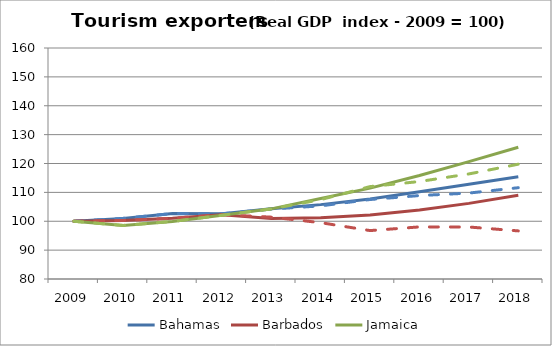
| Category | Bahamas | stress | Barbados | Jamaica |
|---|---|---|---|---|
| 2009.0 | 100 | 100 | 100 | 100 |
| 2010.0 | 100.992 | 98.553 | 100.282 | 98.553 |
| 2011.0 | 102.671 | 99.937 | 101.033 | 99.937 |
| 2012.0 | 102.571 | 102.081 | 102.29 | 102.081 |
| 2013.0 | 104.303 | 104.247 | 100.97 | 104.293 |
| 2014.0 | 105.755 | 107.484 | 101.184 | 107.853 |
| 2015.0 | 107.727 | 112.01 | 102.19 | 111.459 |
| 2016.0 | 110.234 | 113.759 | 103.872 | 115.828 |
| 2017.0 | 112.812 | 116.386 | 106.194 | 120.646 |
| 2018.0 | 115.434 | 119.757 | 109.039 | 125.63 |